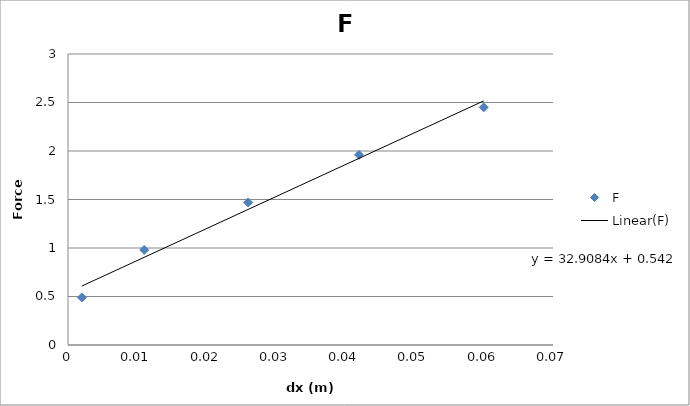
| Category | F |
|---|---|
| 0.002 | 0.49 |
| 0.011 | 0.98 |
| 0.026 | 1.47 |
| 0.042 | 1.96 |
| 0.06 | 2.45 |